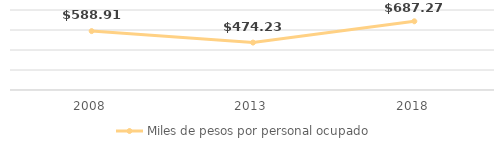
| Category | Miles de pesos por personal ocupado |
|---|---|
| 2008.0 | 588.912 |
| 2013.0 | 474.234 |
| 2018.0 | 687.274 |